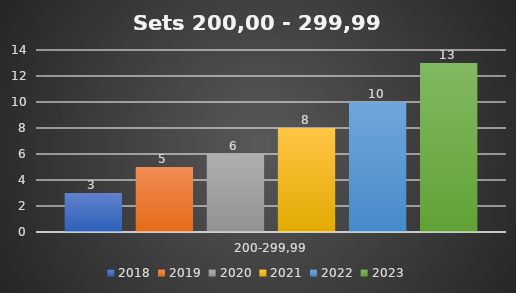
| Category | 2018 | 2019 | 2020 | 2021 | 2022 | 2023 |
|---|---|---|---|---|---|---|
| 200-299,99 | 3 | 5 | 6 | 8 | 10 | 13 |